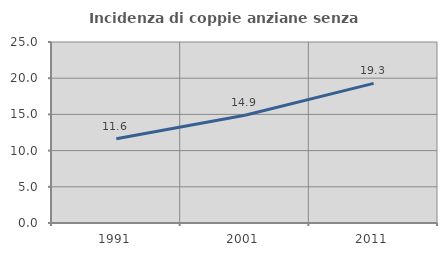
| Category | Incidenza di coppie anziane senza figli  |
|---|---|
| 1991.0 | 11.633 |
| 2001.0 | 14.885 |
| 2011.0 | 19.28 |